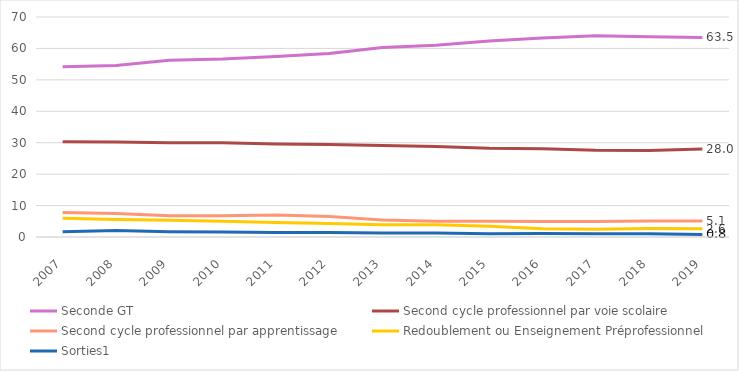
| Category | Seconde GT | Second cycle professionnel par voie scolaire | Second cycle professionnel par apprentissage | Redoublement ou Enseignement Préprofessionnel | Sorties1 |
|---|---|---|---|---|---|
| 2007.0 | 54.2 | 30.3 | 7.8 | 6 | 1.7 |
| 2008.0 | 54.6 | 30.2 | 7.5 | 5.6 | 2.1 |
| 2009.0 | 56.2 | 30 | 6.8 | 5.3 | 1.7 |
| 2010.0 | 56.6 | 30 | 6.8 | 5 | 1.6 |
| 2011.0 | 57.4 | 29.6 | 7 | 4.6 | 1.4 |
| 2012.0 | 58.4 | 29.4 | 6.5 | 4.3 | 1.4 |
| 2013.0 | 60.3 | 29.1 | 5.4 | 3.9 | 1.3 |
| 2014.0 | 61 | 28.8 | 5 | 3.9 | 1.3 |
| 2015.0 | 62.4 | 28.2 | 5 | 3.4 | 1 |
| 2016.0 | 63.3 | 28.1 | 4.9 | 2.6 | 1.1 |
| 2017.0 | 64 | 27.6 | 4.9 | 2.5 | 1 |
| 2018.0 | 63.7 | 27.5 | 5.1 | 2.7 | 1 |
| 2019.0 | 63.5 | 28 | 5.1 | 2.6 | 0.8 |